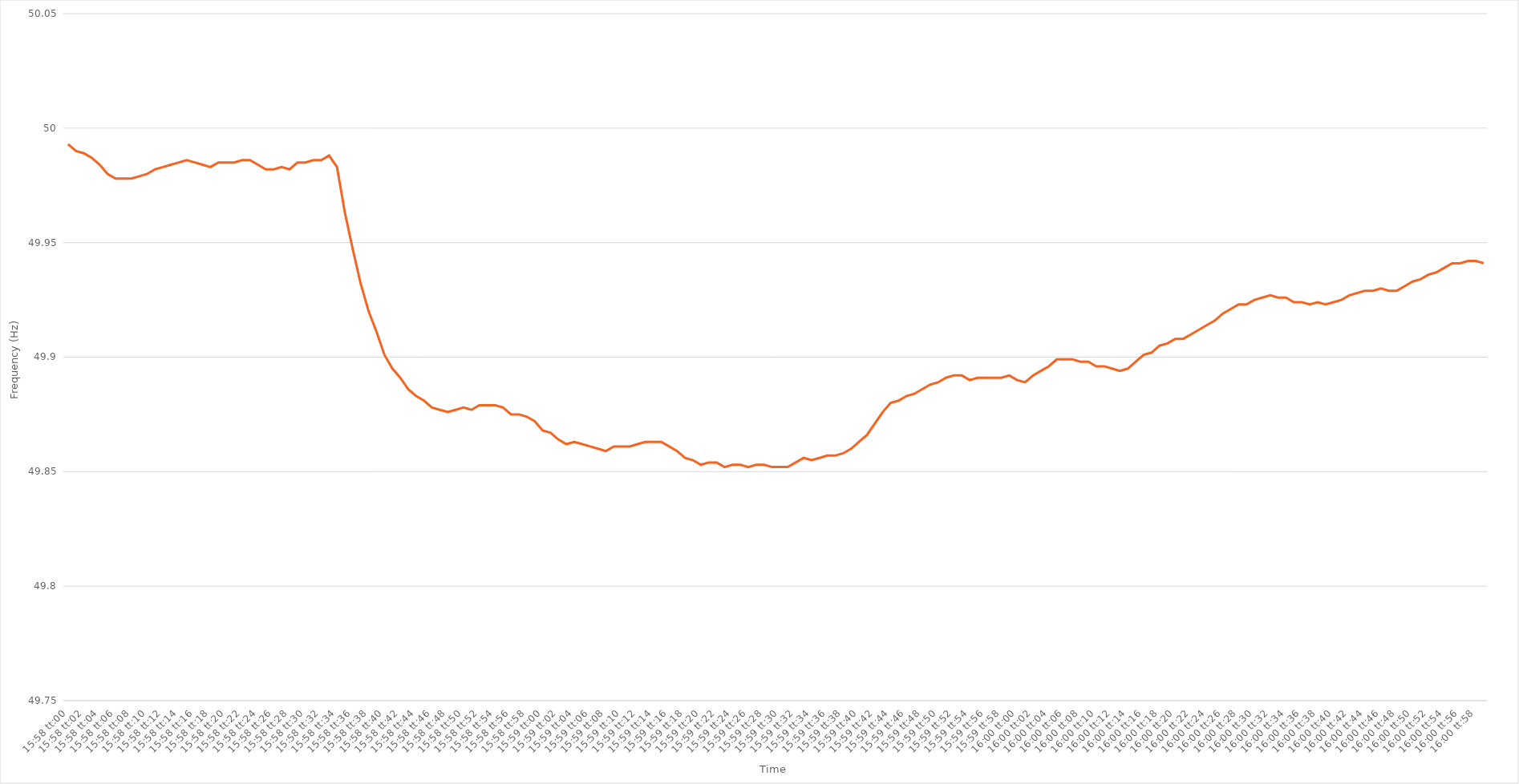
| Category | Series 0 |
|---|---|
| 0.6652777777777777 | 49.993 |
| 0.6652893518518518 | 49.99 |
| 0.6653009259259259 | 49.989 |
| 0.6653125 | 49.987 |
| 0.6653240740740741 | 49.984 |
| 0.6653356481481482 | 49.98 |
| 0.6653472222222222 | 49.978 |
| 0.6653587962962962 | 49.978 |
| 0.6653703703703704 | 49.978 |
| 0.6653819444444444 | 49.979 |
| 0.6653935185185186 | 49.98 |
| 0.6654050925925926 | 49.982 |
| 0.6654166666666667 | 49.983 |
| 0.6654282407407407 | 49.984 |
| 0.6654398148148148 | 49.985 |
| 0.6654513888888889 | 49.986 |
| 0.665462962962963 | 49.985 |
| 0.6654745370370371 | 49.984 |
| 0.6654861111111111 | 49.983 |
| 0.6654976851851852 | 49.985 |
| 0.6655092592592592 | 49.985 |
| 0.6655208333333333 | 49.985 |
| 0.6655324074074074 | 49.986 |
| 0.6655439814814815 | 49.986 |
| 0.6655555555555556 | 49.984 |
| 0.6655671296296296 | 49.982 |
| 0.6655787037037036 | 49.982 |
| 0.6655902777777778 | 49.983 |
| 0.6656018518518518 | 49.982 |
| 0.665613425925926 | 49.985 |
| 0.665625 | 49.985 |
| 0.6656365740740741 | 49.986 |
| 0.6656481481481481 | 49.986 |
| 0.6656597222222222 | 49.988 |
| 0.6656712962962963 | 49.983 |
| 0.6656828703703704 | 49.963 |
| 0.6656944444444445 | 49.947 |
| 0.6657060185185185 | 49.932 |
| 0.6657175925925926 | 49.92 |
| 0.6657291666666666 | 49.911 |
| 0.6657407407407407 | 49.901 |
| 0.6657523148148148 | 49.895 |
| 0.6657638888888889 | 49.891 |
| 0.665775462962963 | 49.886 |
| 0.665787037037037 | 49.883 |
| 0.665798611111111 | 49.881 |
| 0.6658101851851852 | 49.878 |
| 0.6658217592592592 | 49.877 |
| 0.6658333333333334 | 49.876 |
| 0.6658449074074074 | 49.877 |
| 0.6658564814814815 | 49.878 |
| 0.6658680555555555 | 49.877 |
| 0.6658796296296297 | 49.879 |
| 0.6658912037037037 | 49.879 |
| 0.6659027777777778 | 49.879 |
| 0.6659143518518519 | 49.878 |
| 0.6659259259259259 | 49.875 |
| 0.6659375 | 49.875 |
| 0.6659490740740741 | 49.874 |
| 0.6659606481481481 | 49.872 |
| 0.6659722222222222 | 49.868 |
| 0.6659837962962963 | 49.867 |
| 0.6659953703703704 | 49.864 |
| 0.6660069444444444 | 49.862 |
| 0.6660185185185185 | 49.863 |
| 0.6660300925925926 | 49.862 |
| 0.6660416666666666 | 49.861 |
| 0.6660532407407408 | 49.86 |
| 0.6660648148148148 | 49.859 |
| 0.6660763888888889 | 49.861 |
| 0.6660879629629629 | 49.861 |
| 0.6660995370370371 | 49.861 |
| 0.6661111111111111 | 49.862 |
| 0.6661226851851852 | 49.863 |
| 0.6661342592592593 | 49.863 |
| 0.6661458333333333 | 49.863 |
| 0.6661574074074074 | 49.861 |
| 0.6661689814814815 | 49.859 |
| 0.6661805555555556 | 49.856 |
| 0.6661921296296297 | 49.855 |
| 0.6662037037037037 | 49.853 |
| 0.6662152777777778 | 49.854 |
| 0.6662268518518518 | 49.854 |
| 0.6662384259259259 | 49.852 |
| 0.66625 | 49.853 |
| 0.666261574074074 | 49.853 |
| 0.6662731481481482 | 49.852 |
| 0.6662847222222222 | 49.853 |
| 0.6662962962962963 | 49.853 |
| 0.6663078703703703 | 49.852 |
| 0.6663194444444445 | 49.852 |
| 0.6663310185185185 | 49.852 |
| 0.6663425925925927 | 49.854 |
| 0.6663541666666667 | 49.856 |
| 0.6663657407407407 | 49.855 |
| 0.6663773148148148 | 49.856 |
| 0.6663888888888889 | 49.857 |
| 0.666400462962963 | 49.857 |
| 0.6664120370370371 | 49.858 |
| 0.6664236111111111 | 49.86 |
| 0.6664351851851852 | 49.863 |
| 0.6664467592592592 | 49.866 |
| 0.6664583333333333 | 49.871 |
| 0.6664699074074074 | 49.876 |
| 0.6664814814814815 | 49.88 |
| 0.6664930555555556 | 49.881 |
| 0.6665046296296296 | 49.883 |
| 0.6665162037037037 | 49.884 |
| 0.6665277777777777 | 49.886 |
| 0.6665393518518519 | 49.888 |
| 0.6665509259259259 | 49.889 |
| 0.6665625000000001 | 49.891 |
| 0.6665740740740741 | 49.892 |
| 0.6665856481481481 | 49.892 |
| 0.6665972222222222 | 49.89 |
| 0.6666087962962963 | 49.891 |
| 0.6666203703703704 | 49.891 |
| 0.6666319444444445 | 49.891 |
| 0.6666435185185186 | 49.891 |
| 0.6666550925925926 | 49.892 |
| 0.6666666666666666 | 49.89 |
| 0.6666782407407408 | 49.889 |
| 0.6666898148148147 | 49.892 |
| 0.6667013888888889 | 49.894 |
| 0.666712962962963 | 49.896 |
| 0.666724537037037 | 49.899 |
| 0.6667361111111111 | 49.899 |
| 0.6667476851851851 | 49.899 |
| 0.6667592592592593 | 49.898 |
| 0.6667708333333334 | 49.898 |
| 0.6667824074074074 | 49.896 |
| 0.6667939814814815 | 49.896 |
| 0.6668055555555555 | 49.895 |
| 0.6668171296296297 | 49.894 |
| 0.6668287037037036 | 49.895 |
| 0.6668402777777778 | 49.898 |
| 0.6668518518518519 | 49.901 |
| 0.666863425925926 | 49.902 |
| 0.666875 | 49.905 |
| 0.666886574074074 | 49.906 |
| 0.6668981481481482 | 49.908 |
| 0.6669097222222221 | 49.908 |
| 0.6669212962962963 | 49.91 |
| 0.6669328703703704 | 49.912 |
| 0.6669444444444445 | 49.914 |
| 0.6669560185185185 | 49.916 |
| 0.6669675925925925 | 49.919 |
| 0.6669791666666667 | 49.921 |
| 0.6669907407407408 | 49.923 |
| 0.6670023148148148 | 49.923 |
| 0.6670138888888889 | 49.925 |
| 0.667025462962963 | 49.926 |
| 0.6670370370370371 | 49.927 |
| 0.667048611111111 | 49.926 |
| 0.6670601851851852 | 49.926 |
| 0.6670717592592593 | 49.924 |
| 0.6670833333333334 | 49.924 |
| 0.6670949074074074 | 49.923 |
| 0.6671064814814814 | 49.924 |
| 0.6671180555555556 | 49.923 |
| 0.6671296296296297 | 49.924 |
| 0.6671412037037037 | 49.925 |
| 0.6671527777777778 | 49.927 |
| 0.6671643518518519 | 49.928 |
| 0.6671759259259259 | 49.929 |
| 0.6671874999999999 | 49.929 |
| 0.6671990740740741 | 49.93 |
| 0.6672106481481482 | 49.929 |
| 0.6672222222222222 | 49.929 |
| 0.6672337962962963 | 49.931 |
| 0.6672453703703703 | 49.933 |
| 0.6672569444444445 | 49.934 |
| 0.6672685185185184 | 49.936 |
| 0.6672800925925926 | 49.937 |
| 0.6672916666666667 | 49.939 |
| 0.6673032407407408 | 49.941 |
| 0.6673148148148148 | 49.941 |
| 0.6673263888888888 | 49.942 |
| 0.667337962962963 | 49.942 |
| 0.6673495370370371 | 49.941 |